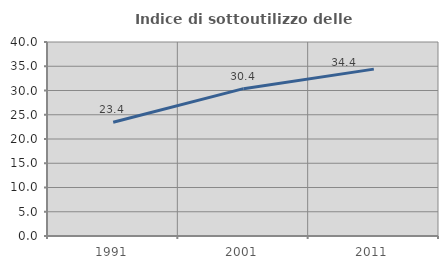
| Category | Indice di sottoutilizzo delle abitazioni  |
|---|---|
| 1991.0 | 23.439 |
| 2001.0 | 30.377 |
| 2011.0 | 34.408 |